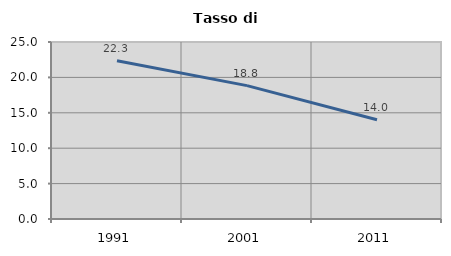
| Category | Tasso di disoccupazione   |
|---|---|
| 1991.0 | 22.345 |
| 2001.0 | 18.839 |
| 2011.0 | 14.012 |